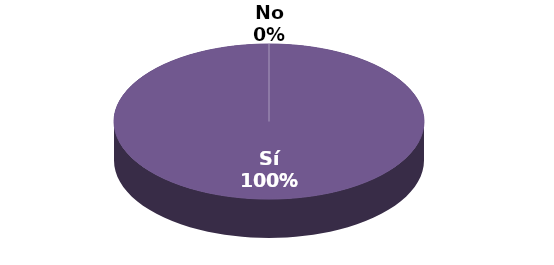
| Category | Series 1 |
|---|---|
| Sí | 10 |
| No | 0 |